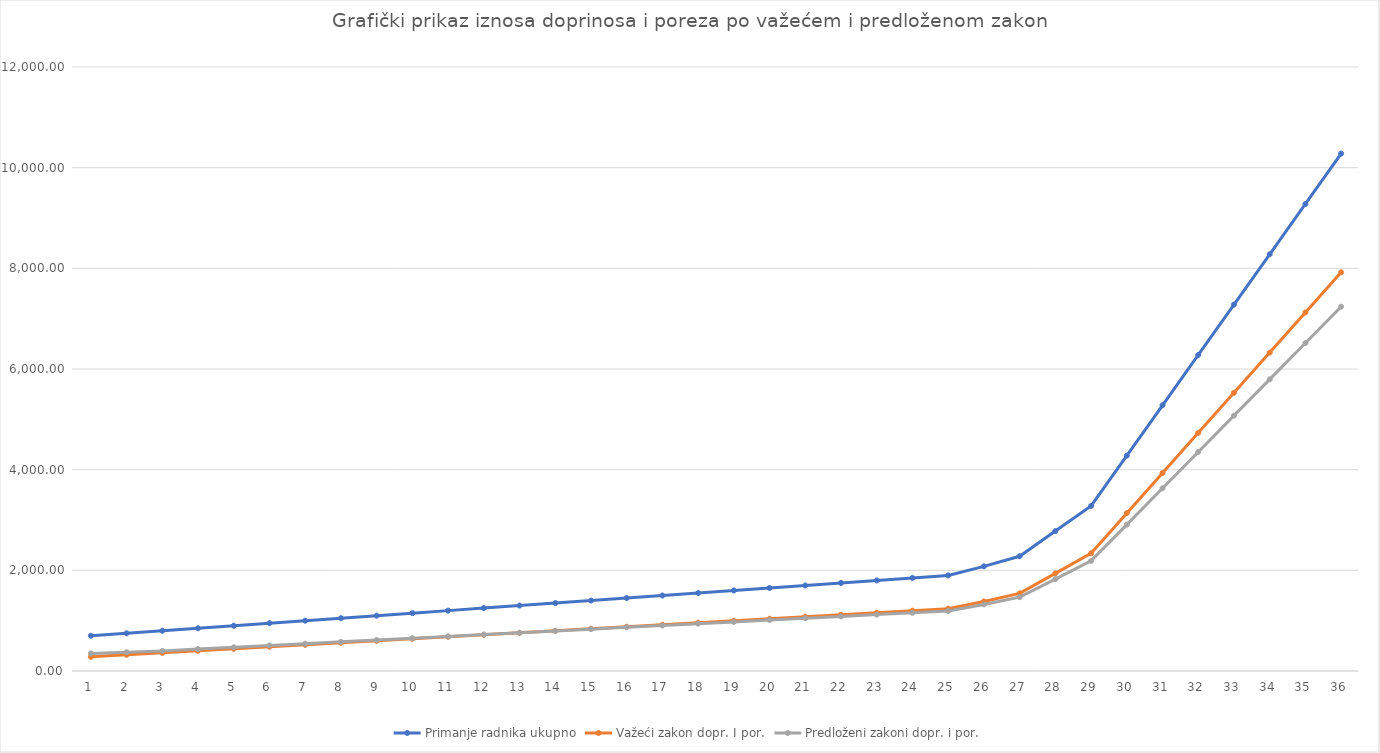
| Category | Primanje radnika ukupno | Važeći zakon dopr. I por. | Predloženi zakoni dopr. i por. |
|---|---|---|---|
| 0 | 699.5 | 281.29 | 348.98 |
| 1 | 749.5 | 321.17 | 373.92 |
| 2 | 799.5 | 361.06 | 398.86 |
| 3 | 849.5 | 400.92 | 434.83 |
| 4 | 899.5 | 440.8 | 470.89 |
| 5 | 949.5 | 480.65 | 506.96 |
| 6 | 999.5 | 520.54 | 543.02 |
| 7 | 1049.5 | 560.4 | 579.1 |
| 8 | 1099.5 | 600.28 | 615.17 |
| 9 | 1149.5 | 640.14 | 651.23 |
| 10 | 1199.5 | 680.03 | 687.3 |
| 11 | 1249.5 | 719.91 | 723.37 |
| 12 | 1299.5 | 759.76 | 759.44 |
| 13 | 1349.5 | 799.64 | 795.5 |
| 14 | 1399.5 | 839.51 | 831.58 |
| 15 | 1449.5 | 879.39 | 867.65 |
| 16 | 1499.5 | 919.25 | 903.71 |
| 17 | 1549.5 | 959.12 | 939.78 |
| 18 | 1599.5 | 999 | 975.85 |
| 19 | 1649.5 | 1038.87 | 1011.92 |
| 20 | 1699.5 | 1078.75 | 1047.98 |
| 21 | 1749.5 | 1118.61 | 1084.05 |
| 22 | 1799.5 | 1158.49 | 1120.13 |
| 23 | 1849.5 | 1198.36 | 1156.19 |
| 24 | 1899.5 | 1238.23 | 1192.26 |
| 25 | 2079.5 | 1381.77 | 1322.1 |
| 26 | 2279.5 | 1541.25 | 1466.38 |
| 27 | 2779.5 | 1939.99 | 1827.06 |
| 28 | 3279.5 | 2338.7 | 2187.75 |
| 29 | 4279.5 | 3136.14 | 2909.11 |
| 30 | 5279.5 | 3933.59 | 3630.48 |
| 31 | 6279.5 | 4731.03 | 4351.85 |
| 32 | 7279.5 | 5528.47 | 5073.21 |
| 33 | 8279.5 | 6325.91 | 5794.58 |
| 34 | 9279.5 | 7123.35 | 6515.94 |
| 35 | 10279.5 | 7920.79 | 7237.32 |